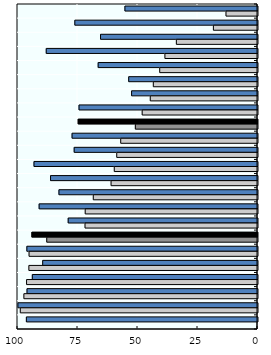
| Category | Urban | Rural |
|---|---|---|
| Papua New Guinea | 55.239 | 13.128 |
| Solomon Islands | 76.109 | 18.376 |
| India | 65.401 | 33.804 |
| Cambodia | 88.027 | 38.578 |
| Mongolia | 66.393 | 40.744 |
| Bangladesh | 53.665 | 43.409 |
| Nepal | 52.455 | 44.679 |
| Pakistan | 74.366 | 48.053 |
| Asia Pacific-LM/L | 74.701 | 50.896 |
| Indonesia | 77.26 | 56.997 |
| Myanmar | 76.38 | 58.651 |
| Lao PDR | 93.125 | 59.68 |
| China | 86.231 | 61.012 |
| Korea, DPR | 82.734 | 68.422 |
| Viet Nam | 90.986 | 71.788 |
| Philippines | 78.875 | 71.867 |
| Asia Pacific-UM | 93.994 | 87.813 |
| Fiji | 96.099 | 95.187 |
| Sri Lanka | 89.499 | 95.265 |
| Thailand | 93.822 | 96.219 |
| Brunei Darussalam | 96.033 | 97.338 |
| Malaysia | 99.824 | 98.836 |
| Hong Kong, China | 96.3 | 0 |